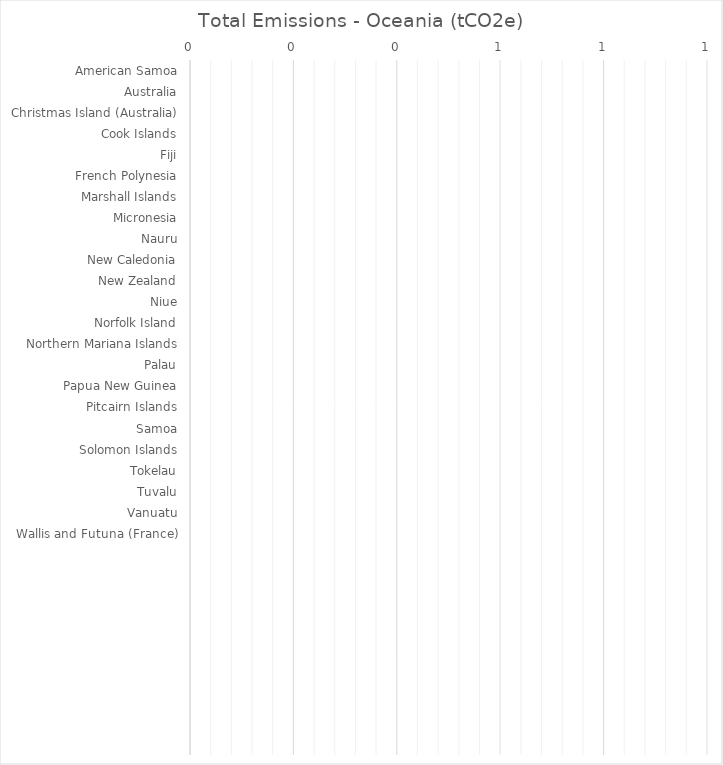
| Category | Total Emissions - Oceania (tCO2e) |
|---|---|
| American Samoa | 0 |
| Australia | 0 |
| Christmas Island (Australia) | 0 |
| Cook Islands | 0 |
| Fiji | 0 |
| French Polynesia | 0 |
| Marshall Islands | 0 |
| Micronesia | 0 |
| Nauru | 0 |
| New Caledonia | 0 |
| New Zealand | 0 |
| Niue | 0 |
| Norfolk Island | 0 |
| Northern Mariana Islands | 0 |
| Palau | 0 |
| Papua New Guinea | 0 |
| Pitcairn Islands | 0 |
| Samoa | 0 |
| Solomon Islands | 0 |
| Tokelau | 0 |
| Tuvalu | 0 |
| Vanuatu | 0 |
| Wallis and Futuna (France) | 0 |